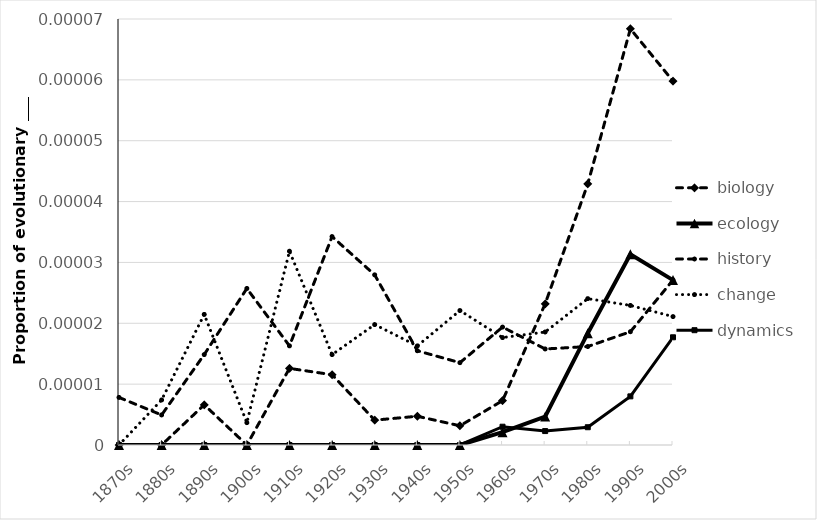
| Category | biology | ecology | history | change | dynamics |
|---|---|---|---|---|---|
| 1870s | 0 | 0 | 0 | 0 | 0 |
| 1880s | 0 | 0 | 0 | 0 | 0 |
| 1890s | 0 | 0 | 0 | 0 | 0 |
| 1900s | 0 | 0 | 0 | 0 | 0 |
| 1910s | 0 | 0 | 0 | 0 | 0 |
| 1920s | 0 | 0 | 0 | 0 | 0 |
| 1930s | 0 | 0 | 0 | 0 | 0 |
| 1940s | 0 | 0 | 0 | 0 | 0 |
| 1950s | 0 | 0 | 0 | 0 | 0 |
| 1960s | 0 | 0 | 0 | 0 | 0 |
| 1970s | 0 | 0 | 0 | 0 | 0 |
| 1980s | 0 | 0 | 0 | 0 | 0 |
| 1990s | 0 | 0 | 0 | 0 | 0 |
| 2000s | 0 | 0 | 0 | 0 | 0 |